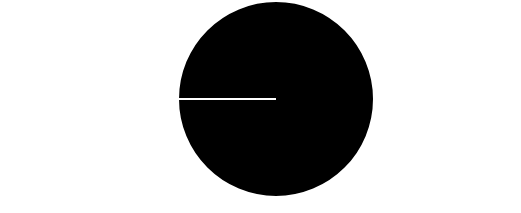
| Category | flecha |
|---|---|
| 0 | 0 |
| 1 | 3 |
| 2 | 0 |